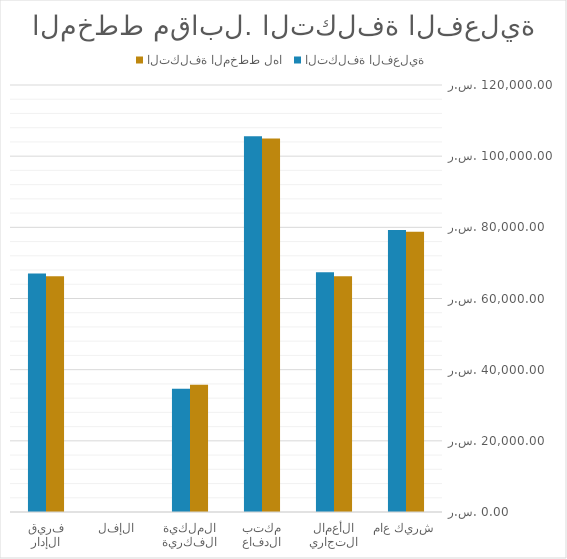
| Category | التكلفة المخطط لها | التكلفة الفعلية |
|---|---|---|
| شريك عام | 78750 | 79275 |
| الأعمال التجارية | 66250 | 67375 |
| مكتب الدفاع | 105000 | 105600 |
| الملكية الفكرية | 35750 | 34650 |
| الإفلاس | 0 | 0 |
| فريق الإدارة | 66250 | 67000 |